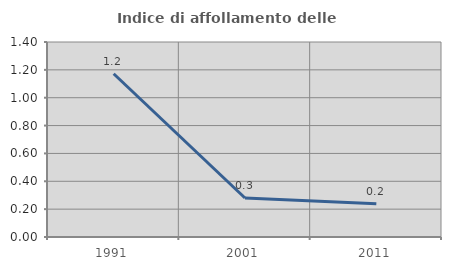
| Category | Indice di affollamento delle abitazioni  |
|---|---|
| 1991.0 | 1.172 |
| 2001.0 | 0.28 |
| 2011.0 | 0.239 |